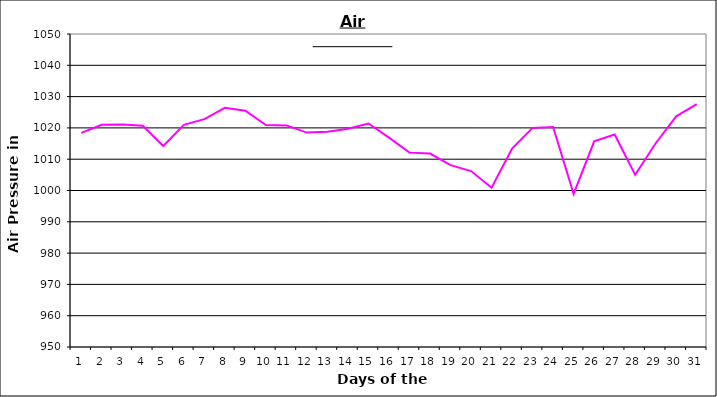
| Category | Series 0 |
|---|---|
| 0 | 1018.4 |
| 1 | 1021 |
| 2 | 1021.1 |
| 3 | 1020.7 |
| 4 | 1014.2 |
| 5 | 1021 |
| 6 | 1022.8 |
| 7 | 1026.4 |
| 8 | 1025.5 |
| 9 | 1020.9 |
| 10 | 1020.8 |
| 11 | 1018.5 |
| 12 | 1018.8 |
| 13 | 1019.7 |
| 14 | 1021.4 |
| 15 | 1016.9 |
| 16 | 1012.1 |
| 17 | 1011.8 |
| 18 | 1008.1 |
| 19 | 1006.2 |
| 20 | 1000.9 |
| 21 | 1013.4 |
| 22 | 1020 |
| 23 | 1020.3 |
| 24 | 998.9 |
| 25 | 1015.7 |
| 26 | 1017.9 |
| 27 | 1005 |
| 28 | 1015.1 |
| 29 | 1023.7 |
| 30 | 1027.6 |